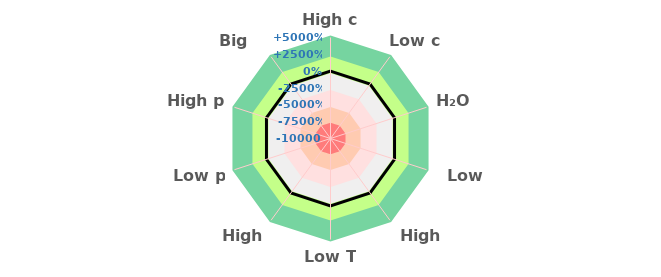
| Category | High c | Series 0 |
|---|---|---|
| High c | 37.5 | 0 |
| Low c | 37.5 | 0 |
| H₂O | 37.5 | 0 |
| Low O₂ | 37.5 | 0 |
| High O₂ | 37.5 | 0 |
| Low T | 37.5 | 0 |
| High T | 37.5 | 0 |
| Low p | 37.5 | 0 |
| High p | 37.5 | 0 |
| Big Scale | 37.5 | 0 |